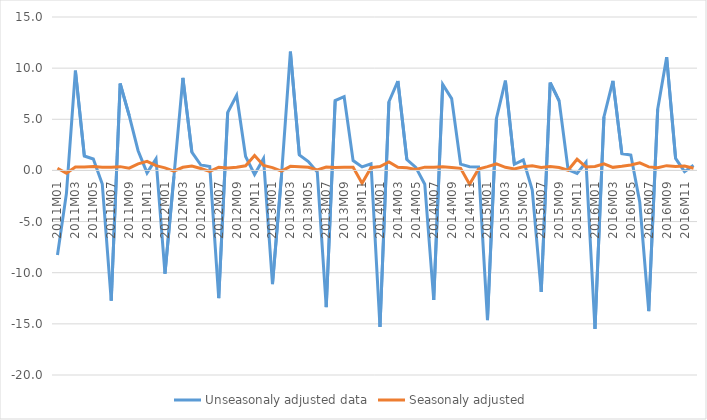
| Category | Unseasonaly adjusted data | Seasonaly adjusted |
|---|---|---|
| 2011M01 | -8.268 | 0.208 |
| 2011M02 | -2.242 | -0.28 |
| 2011M03 | 9.765 | 0.335 |
| 2011M04 | 1.407 | 0.343 |
| 2011M05 | 1.112 | 0.387 |
| 2011M06 | -1.322 | 0.315 |
| 2011M07 | -12.729 | 0.319 |
| 2011M08 | 8.493 | 0.371 |
| 2011M09 | 5.377 | 0.227 |
| 2011M10 | 1.926 | 0.635 |
| 2011M11 | -0.241 | 0.889 |
| 2011M12 | 1.129 | 0.472 |
| 2012M01 | -10.085 | 0.254 |
| 2012M02 | -0.587 | -0.073 |
| 2012M03 | 9.052 | 0.31 |
| 2012M04 | 1.789 | 0.436 |
| 2012M05 | 0.532 | 0.185 |
| 2012M06 | 0.39 | -0.093 |
| 2012M07 | -12.489 | 0.313 |
| 2012M08 | 5.663 | 0.247 |
| 2012M09 | 7.35 | 0.31 |
| 2012M10 | 1.363 | 0.45 |
| 2012M11 | -0.396 | 1.458 |
| 2012M12 | 1.152 | 0.482 |
| 2013M01 | -11.112 | 0.279 |
| 2013M02 | -0.574 | -0.072 |
| 2013M03 | 11.607 | 0.398 |
| 2013M04 | 1.523 | 0.371 |
| 2013M05 | 0.872 | 0.304 |
| 2013M06 | -0.165 | 0.039 |
| 2013M07 | -13.365 | 0.335 |
| 2013M08 | 6.831 | 0.299 |
| 2013M09 | 7.204 | 0.304 |
| 2013M10 | 0.961 | 0.317 |
| 2013M11 | 0.34 | -1.253 |
| 2013M12 | 0.649 | 0.272 |
| 2014M01 | -15.299 | 0.385 |
| 2014M02 | 6.714 | 0.838 |
| 2014M03 | 8.74 | 0.299 |
| 2014M04 | 1.067 | 0.26 |
| 2014M05 | 0.3 | 0.105 |
| 2014M06 | -1.352 | 0.322 |
| 2014M07 | -12.668 | 0.317 |
| 2014M08 | 8.407 | 0.367 |
| 2014M09 | 7.021 | 0.296 |
| 2014M10 | 0.618 | 0.204 |
| 2014M11 | 0.365 | -1.344 |
| 2014M12 | 0.344 | 0.144 |
| 2015M01 | -14.636 | 0.368 |
| 2015M02 | 5.082 | 0.634 |
| 2015M03 | 8.78 | 0.301 |
| 2015M04 | 0.606 | 0.148 |
| 2015M05 | 1.039 | 0.362 |
| 2015M06 | -1.923 | 0.458 |
| 2015M07 | -11.879 | 0.297 |
| 2015M08 | 8.586 | 0.375 |
| 2015M09 | 6.801 | 0.287 |
| 2015M10 | 0.067 | 0.022 |
| 2015M11 | -0.297 | 1.095 |
| 2015M12 | 0.798 | 0.334 |
| 2016M01 | -15.487 | 0.389 |
| 2016M02 | 5.236 | 0.653 |
| 2016M03 | 8.75 | 0.3 |
| 2016M04 | 1.647 | 0.401 |
| 2016M05 | 1.513 | 0.527 |
| 2016M06 | -3.115 | 0.743 |
| 2016M07 | -13.759 | 0.344 |
| 2016M08 | 5.981 | 0.261 |
| 2016M09 | 11.072 | 0.467 |
| 2016M10 | 1.176 | 0.388 |
| 2016M11 | -0.115 | 0.425 |
| 2016M12 | 0.51 | 0.213 |